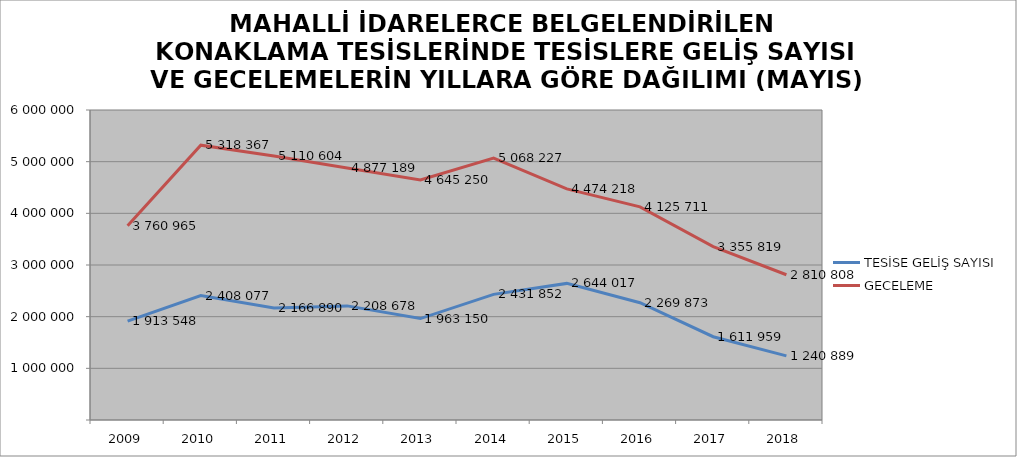
| Category | TESİSE GELİŞ SAYISI | GECELEME |
|---|---|---|
| 2009 | 1913548 | 3760965 |
| 2010 | 2408077 | 5318367 |
| 2011 | 2166890 | 5110604 |
| 2012 | 2208678 | 4877189 |
| 2013 | 1963150 | 4645250 |
| 2014 | 2431852 | 5068227 |
| 2015 | 2644017 | 4474218 |
| 2016 | 2269873 | 4125711 |
| 2017 | 1611959 | 3355819 |
| 2018 | 1240889 | 2810808 |